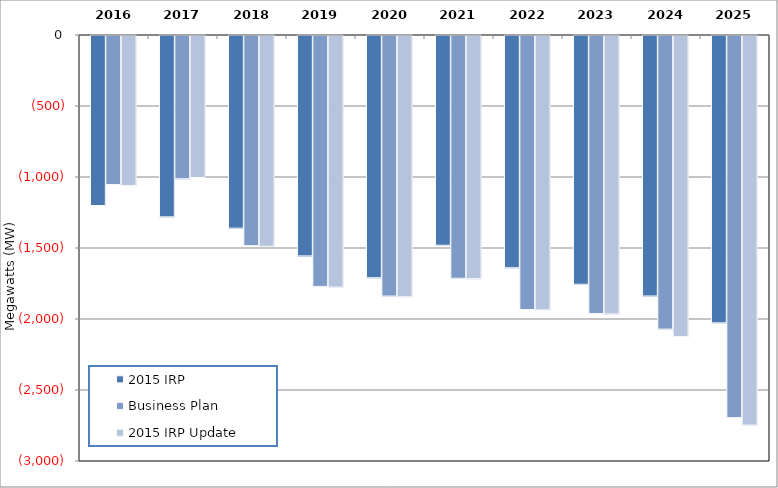
| Category | 2015 IRP | Business Plan | 2015 IRP Update  |
|---|---|---|---|
| 2016.0 | -1197.213 | -1049.623 | -1056.073 |
| 2017.0 | -1276.904 | -1008.553 | -1000.212 |
| 2018.0 | -1356.571 | -1479.539 | -1484.288 |
| 2019.0 | -1552.005 | -1766.96 | -1771.83 |
| 2020.0 | -1705.514 | -1834.785 | -1839.784 |
| 2021.0 | -1477.032 | -1709.698 | -1712.217 |
| 2022.0 | -1635.157 | -1929.514 | -1932.153 |
| 2023.0 | -1751.616 | -1957.971 | -1960.731 |
| 2024.0 | -1834.337 | -2067.427 | -2120.187 |
| 2025.0 | -2023.34 | -2690.464 | -2743.344 |